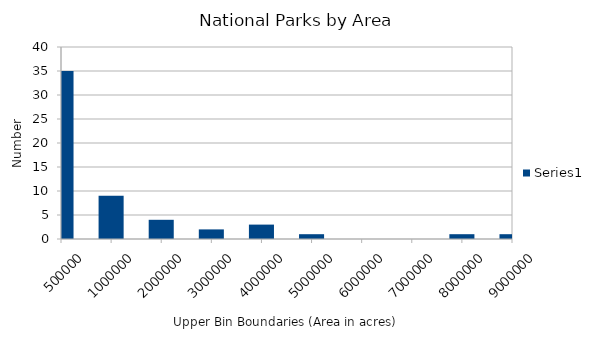
| Category | Series 0 |
|---|---|
| 500000 | 35 |
| 1000000 | 9 |
| 2000000 | 4 |
| 3000000 | 2 |
| 4000000 | 3 |
| 5000000 | 1 |
| 6000000 | 0 |
| 7000000 | 0 |
| 8000000 | 1 |
| 9000000 | 1 |